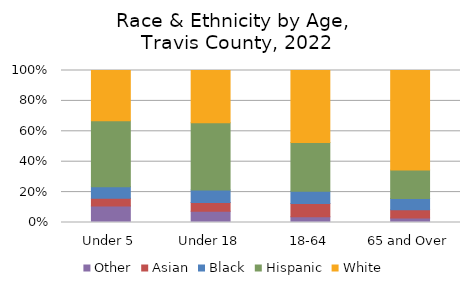
| Category | Other | Asian | Black | Hispanic | White |
|---|---|---|---|---|---|
| Under 5 | 0.109 | 0.05 | 0.076 | 0.435 | 0.33 |
| Under 18 | 0.074 | 0.057 | 0.083 | 0.441 | 0.345 |
| 18-64 | 0.038 | 0.086 | 0.081 | 0.321 | 0.474 |
| 65 and Over | 0.029 | 0.055 | 0.074 | 0.188 | 0.654 |